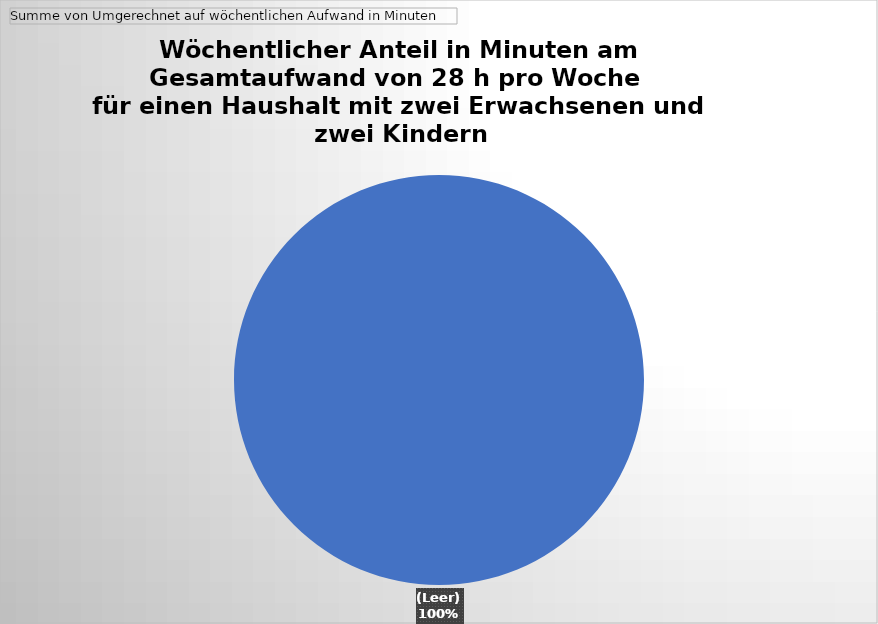
| Category | Ergebnis |
|---|---|
| (Leer) | 1666.125 |